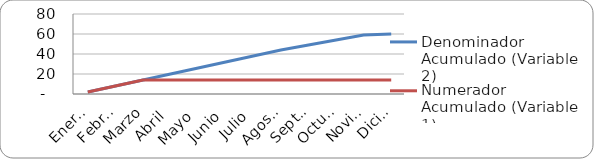
| Category | Denominador Acumulado (Variable 2) | Numerador Acumulado (Variable 1) |
|---|---|---|
| Enero  | 2 | 2 |
| Febrero | 8 | 8 |
| Marzo | 14 | 14 |
| Abril | 20 | 14 |
| Mayo | 26 | 14 |
| Junio | 32 | 14 |
| Julio | 38 | 14 |
| Agosto | 44 | 14 |
| Septiembre | 49 | 14 |
| Octubre | 54 | 14 |
| Noviembre | 59 | 14 |
| Diciembre | 60 | 14 |